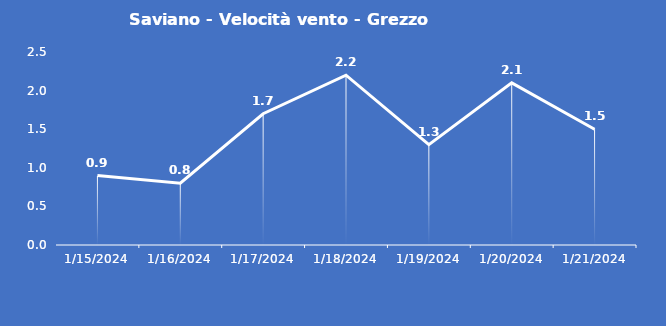
| Category | Saviano - Velocità vento - Grezzo (m/s) |
|---|---|
| 1/15/24 | 0.9 |
| 1/16/24 | 0.8 |
| 1/17/24 | 1.7 |
| 1/18/24 | 2.2 |
| 1/19/24 | 1.3 |
| 1/20/24 | 2.1 |
| 1/21/24 | 1.5 |